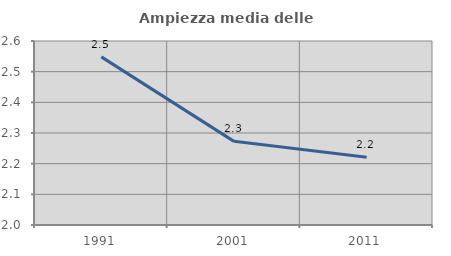
| Category | Ampiezza media delle famiglie |
|---|---|
| 1991.0 | 2.548 |
| 2001.0 | 2.273 |
| 2011.0 | 2.221 |